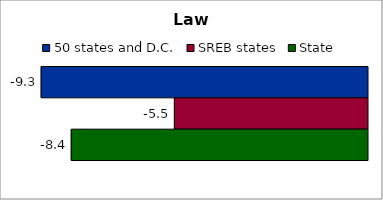
| Category | 50 states and D.C. | SREB states | State |
|---|---|---|---|
| 0 | -9.271 | -5.486 | -8.417 |